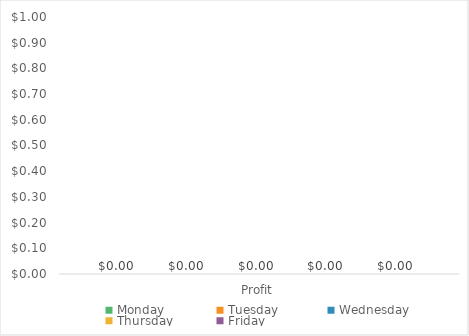
| Category | Monday | Tuesday | Wednesday | Thursday | Friday |
|---|---|---|---|---|---|
| Profit | 0 | 0 | 0 | 0 | 0 |